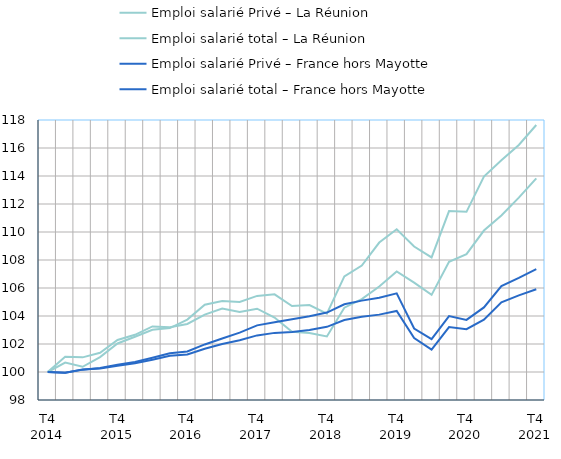
| Category | Emploi salarié Privé – La Réunion | Emploi salarié total – La Réunion | Emploi salarié Privé – France hors Mayotte | Emploi salarié total – France hors Mayotte |
|---|---|---|---|---|
| T4
2014 | 100 | 100 | 100 | 100 |
|  | 100.672 | 101.09 | 99.955 | 99.95 |
|  | 100.375 | 101.045 | 100.169 | 100.183 |
|  | 101.063 | 101.373 | 100.291 | 100.258 |
| T4
2015 | 102.039 | 102.287 | 100.518 | 100.449 |
|  | 102.517 | 102.656 | 100.721 | 100.628 |
|  | 103.012 | 103.254 | 101.021 | 100.88 |
|  | 103.138 | 103.195 | 101.332 | 101.156 |
| T4
2016 | 103.744 | 103.431 | 101.463 | 101.256 |
|  | 104.803 | 104.098 | 101.969 | 101.66 |
|  | 105.078 | 104.536 | 102.391 | 101.999 |
|  | 105.006 | 104.296 | 102.812 | 102.265 |
| T4
2017 | 105.437 | 104.521 | 103.332 | 102.615 |
|  | 105.547 | 103.891 | 103.557 | 102.795 |
|  | 104.717 | 102.87 | 103.762 | 102.864 |
|  | 104.778 | 102.79 | 103.979 | 102.999 |
| T4
2018 | 104.172 | 102.54 | 104.244 | 103.225 |
|  | 106.829 | 104.596 | 104.839 | 103.709 |
|  | 107.605 | 105.202 | 105.099 | 103.942 |
|  | 109.248 | 106.105 | 105.309 | 104.098 |
| T4
2019 | 110.2 | 107.185 | 105.615 | 104.359 |
|  | 108.96 | 106.379 | 103.104 | 102.428 |
|  | 108.186 | 105.509 | 102.35 | 101.597 |
|  | 111.497 | 107.871 | 103.994 | 103.209 |
| T4
2020 | 111.441 | 108.422 | 103.721 | 103.061 |
|  | 113.961 | 110.104 | 104.614 | 103.733 |
|  | 115.117 | 111.175 | 106.13 | 104.982 |
|  | 116.217 | 112.458 | 106.716 | 105.476 |
| T4
2021 | 117.641 | 113.826 | 107.347 | 105.913 |